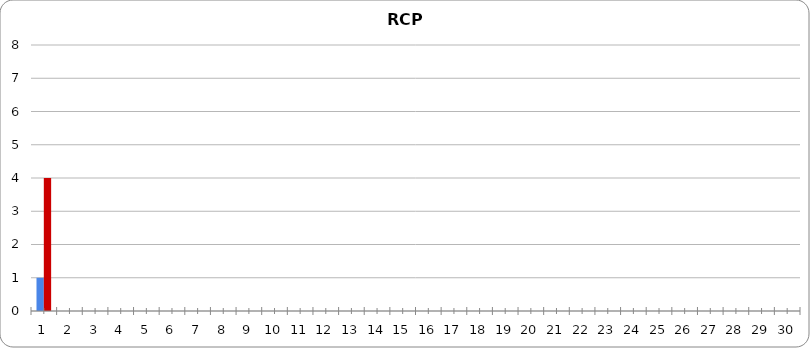
| Category | No. of H | No. of C |
|---|---|---|
| 0 | 1 | 4 |
| 1 | 0 | 0 |
| 2 | 0 | 0 |
| 3 | 0 | 0 |
| 4 | 0 | 0 |
| 5 | 0 | 0 |
| 6 | 0 | 0 |
| 7 | 0 | 0 |
| 8 | 0 | 0 |
| 9 | 0 | 0 |
| 10 | 0 | 0 |
| 11 | 0 | 0 |
| 12 | 0 | 0 |
| 13 | 0 | 0 |
| 14 | 0 | 0 |
| 15 | 0 | 0 |
| 16 | 0 | 0 |
| 17 | 0 | 0 |
| 18 | 0 | 0 |
| 19 | 0 | 0 |
| 20 | 0 | 0 |
| 21 | 0 | 0 |
| 22 | 0 | 0 |
| 23 | 0 | 0 |
| 24 | 0 | 0 |
| 25 | 0 | 0 |
| 26 | 0 | 0 |
| 27 | 0 | 0 |
| 28 | 0 | 0 |
| 29 | 0 | 0 |